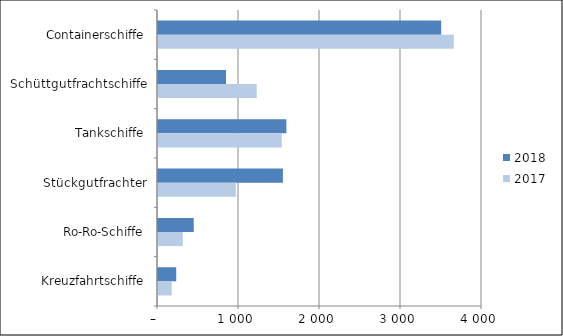
| Category | 2018 | 2017 |
|---|---|---|
| Containerschiffe | 3496 | 3652 |
| Schüttgutfrachtschiffe | 840 | 1219 |
| Tankschiffe | 1585 | 1528 |
| Stückgutfrachter | 1542 | 961 |
| Ro-Ro-Schiffe | 441 | 306 |
| Kreuzfahrtschiffe | 225 | 170 |